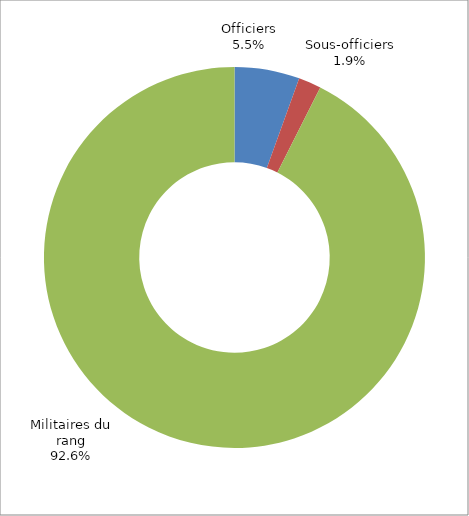
| Category | Series 0 |
|---|---|
| Officiers | 92 |
| Sous-officiers | 32 |
| Militaires du rang | 1544 |